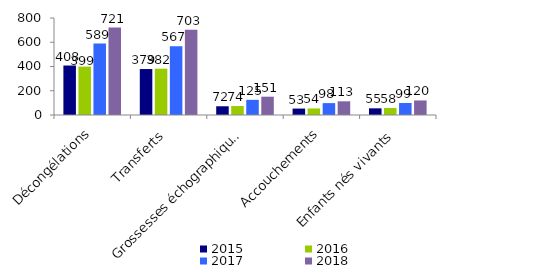
| Category | 2015 | 2016 | 2017 | 2018 |
|---|---|---|---|---|
| Décongélations | 408 | 399 | 589 | 721 |
| Transferts | 379 | 382 | 567 | 703 |
| Grossesses échographiques | 72 | 74 | 125 | 151 |
| Accouchements | 53 | 54 | 98 | 113 |
| Enfants nés vivants | 55 | 58 | 99 | 120 |